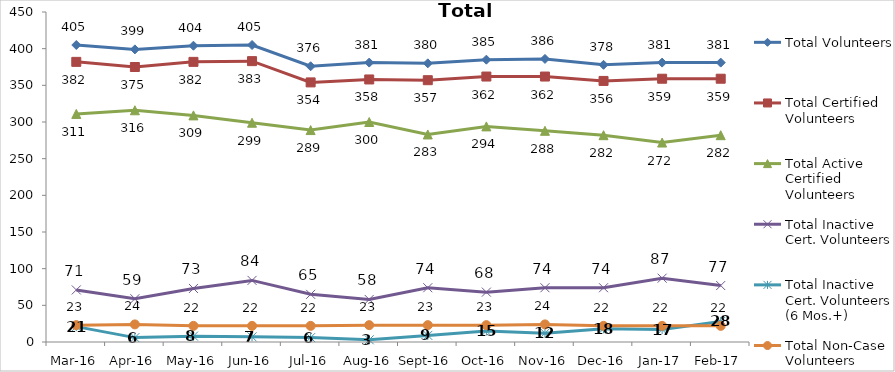
| Category | Total Volunteers | Total Certified Volunteers | Total Active Certified Volunteers | Total Inactive Cert. Volunteers | Total Inactive Cert. Volunteers (6 Mos.+) | Total Non-Case Volunteers |
|---|---|---|---|---|---|---|
| Mar-16 | 405 | 382 | 311 | 71 | 21 | 23 |
| Apr-16 | 399 | 375 | 316 | 59 | 6 | 24 |
| May-16 | 404 | 382 | 309 | 73 | 8 | 22 |
| Jun-16 | 405 | 383 | 299 | 84 | 7 | 22 |
| Jul-16 | 376 | 354 | 289 | 65 | 6 | 22 |
| Aug-16 | 381 | 358 | 300 | 58 | 3 | 23 |
| Sep-16 | 380 | 357 | 283 | 74 | 9 | 23 |
| Oct-16 | 385 | 362 | 294 | 68 | 15 | 23 |
| Nov-16 | 386 | 362 | 288 | 74 | 12 | 24 |
| Dec-16 | 378 | 356 | 282 | 74 | 18 | 22 |
| Jan-17 | 381 | 359 | 272 | 87 | 17 | 22 |
| Feb-17 | 381 | 359 | 282 | 77 | 28 | 22 |